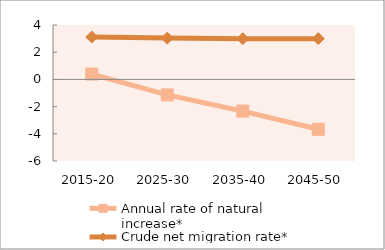
| Category | Annual rate of natural increase* | Crude net migration rate* |
|---|---|---|
| 2015-20 | 0.393 | 3.117 |
| 2025-30 | -1.141 | 3.035 |
| 2035-40 | -2.331 | 2.997 |
| 2045-50 | -3.668 | 2.997 |